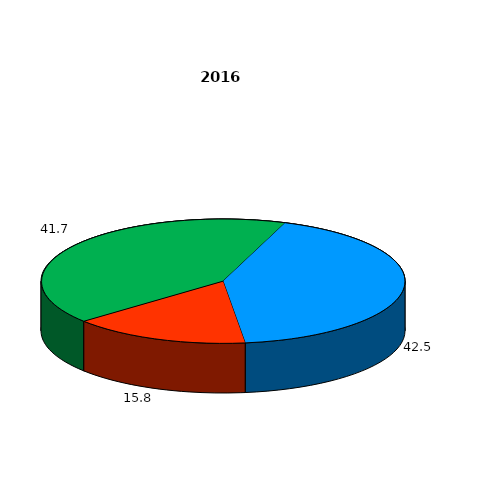
| Category | Series 0 |
|---|---|
| Сельскохозяйственные организации  | 42.5 |
| Крестьянские (фермерские) хозяйства и индивидуальные предприниматели  | 15.8 |
| Личные подсобные и другие индивидуальные хозяйства граждан  | 41.7 |